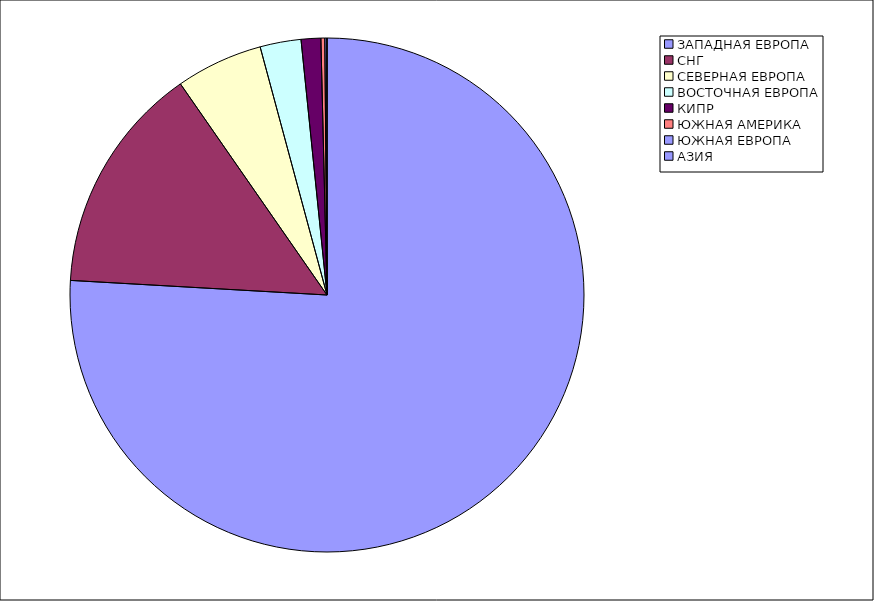
| Category | Оборот |
|---|---|
| ЗАПАДНАЯ ЕВРОПА | 0.759 |
| СНГ | 0.144 |
| СЕВЕРНАЯ ЕВРОПА | 0.055 |
| ВОСТОЧНАЯ ЕВРОПА | 0.026 |
| КИПР | 0.012 |
| ЮЖНАЯ АМЕРИКА | 0.002 |
| ЮЖНАЯ ЕВРОПА | 0.001 |
| АЗИЯ | 0 |